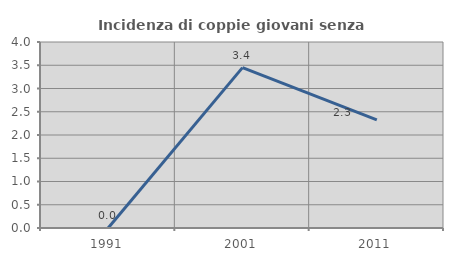
| Category | Incidenza di coppie giovani senza figli |
|---|---|
| 1991.0 | 0 |
| 2001.0 | 3.448 |
| 2011.0 | 2.326 |